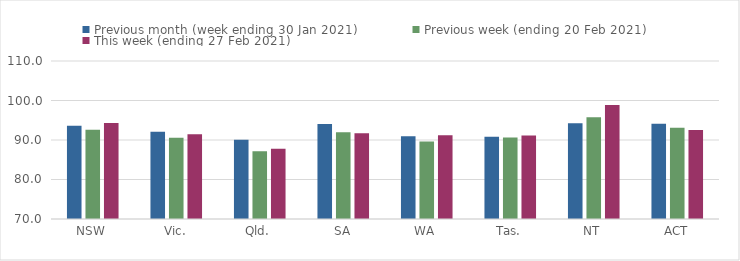
| Category | Previous month (week ending 30 Jan 2021) | Previous week (ending 20 Feb 2021) | This week (ending 27 Feb 2021) |
|---|---|---|---|
| NSW | 93.58 | 92.57 | 94.3 |
| Vic. | 92.12 | 90.55 | 91.44 |
| Qld. | 90.07 | 87.17 | 87.78 |
| SA | 94.08 | 91.97 | 91.69 |
| WA | 90.93 | 89.63 | 91.21 |
| Tas. | 90.82 | 90.61 | 91.11 |
| NT | 94.22 | 95.74 | 98.85 |
| ACT | 94.1 | 93.09 | 92.56 |